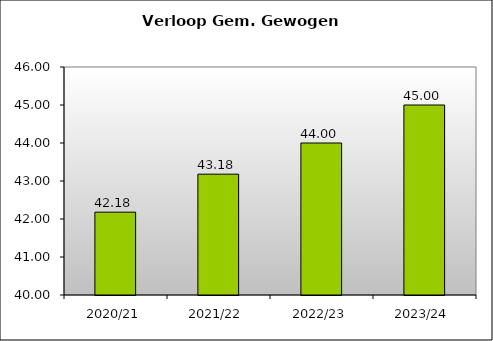
| Category | GGL |
|---|---|
| 2020/21 | 42.18 |
| 2021/22 | 43.18 |
| 2022/23 | 44 |
| 2023/24 | 45 |